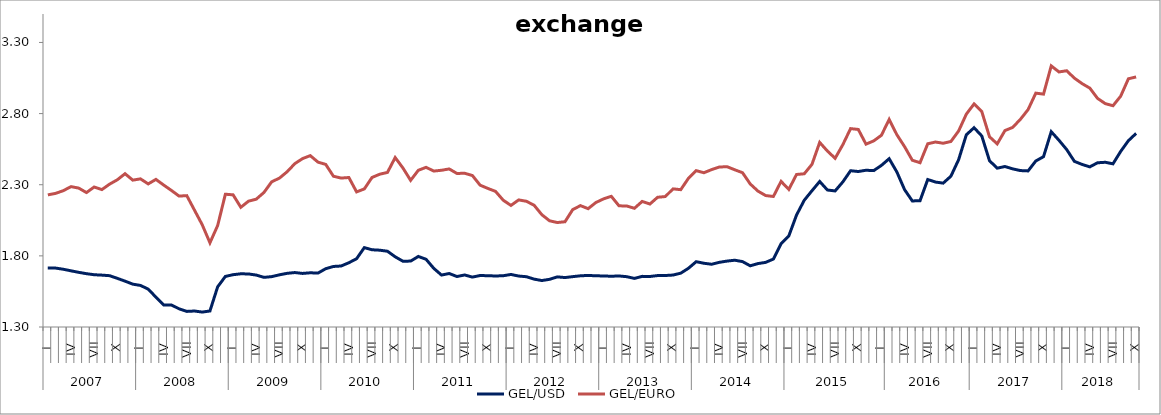
| Category | GEL/USD | GEL/EURO |
|---|---|---|
| 0 | 1.714 | 2.229 |
| 1 | 1.714 | 2.239 |
| 2 | 1.706 | 2.258 |
| 3 | 1.695 | 2.287 |
| 4 | 1.684 | 2.276 |
| 5 | 1.675 | 2.245 |
| 6 | 1.667 | 2.284 |
| 7 | 1.665 | 2.266 |
| 8 | 1.661 | 2.304 |
| 9 | 1.642 | 2.335 |
| 10 | 1.622 | 2.378 |
| 11 | 1.601 | 2.332 |
| 12 | 1.592 | 2.341 |
| 13 | 1.566 | 2.306 |
| 14 | 1.51 | 2.338 |
| 15 | 1.455 | 2.298 |
| 16 | 1.455 | 2.26 |
| 17 | 1.428 | 2.22 |
| 18 | 1.41 | 2.223 |
| 19 | 1.412 | 2.121 |
| 20 | 1.405 | 2.019 |
| 21 | 1.413 | 1.892 |
| 22 | 1.583 | 2.013 |
| 23 | 1.655 | 2.233 |
| 24 | 1.668 | 2.229 |
| 25 | 1.674 | 2.141 |
| 26 | 1.673 | 2.184 |
| 27 | 1.665 | 2.198 |
| 28 | 1.649 | 2.246 |
| 29 | 1.654 | 2.321 |
| 30 | 1.667 | 2.346 |
| 31 | 1.677 | 2.391 |
| 32 | 1.683 | 2.448 |
| 33 | 1.677 | 2.484 |
| 34 | 1.681 | 2.504 |
| 35 | 1.679 | 2.459 |
| 36 | 1.71 | 2.443 |
| 37 | 1.726 | 2.36 |
| 38 | 1.729 | 2.347 |
| 39 | 1.752 | 2.351 |
| 40 | 1.78 | 2.25 |
| 41 | 1.858 | 2.271 |
| 42 | 1.843 | 2.351 |
| 43 | 1.84 | 2.374 |
| 44 | 1.832 | 2.386 |
| 45 | 1.794 | 2.491 |
| 46 | 1.762 | 2.418 |
| 47 | 1.763 | 2.331 |
| 48 | 1.796 | 2.402 |
| 49 | 1.776 | 2.422 |
| 50 | 1.712 | 2.396 |
| 51 | 1.665 | 2.402 |
| 52 | 1.676 | 2.411 |
| 53 | 1.655 | 2.379 |
| 54 | 1.666 | 2.381 |
| 55 | 1.651 | 2.365 |
| 56 | 1.662 | 2.297 |
| 57 | 1.66 | 2.274 |
| 58 | 1.659 | 2.253 |
| 59 | 1.66 | 2.191 |
| 60 | 1.669 | 2.155 |
| 61 | 1.658 | 2.193 |
| 62 | 1.653 | 2.184 |
| 63 | 1.637 | 2.156 |
| 64 | 1.627 | 2.089 |
| 65 | 1.635 | 2.047 |
| 66 | 1.652 | 2.034 |
| 67 | 1.648 | 2.04 |
| 68 | 1.654 | 2.125 |
| 69 | 1.66 | 2.153 |
| 70 | 1.662 | 2.132 |
| 71 | 1.66 | 2.175 |
| 72 | 1.659 | 2.201 |
| 73 | 1.657 | 2.219 |
| 74 | 1.659 | 2.152 |
| 75 | 1.654 | 2.151 |
| 76 | 1.642 | 2.134 |
| 77 | 1.656 | 2.183 |
| 78 | 1.655 | 2.164 |
| 79 | 1.662 | 2.212 |
| 80 | 1.662 | 2.217 |
| 81 | 1.665 | 2.271 |
| 82 | 1.678 | 2.265 |
| 83 | 1.713 | 2.346 |
| 84 | 1.759 | 2.399 |
| 85 | 1.748 | 2.384 |
| 86 | 1.741 | 2.406 |
| 87 | 1.755 | 2.424 |
| 88 | 1.763 | 2.427 |
| 89 | 1.769 | 2.405 |
| 90 | 1.76 | 2.385 |
| 91 | 1.73 | 2.306 |
| 92 | 1.746 | 2.255 |
| 93 | 1.754 | 2.224 |
| 94 | 1.778 | 2.217 |
| 95 | 1.885 | 2.323 |
| 96 | 1.94 | 2.267 |
| 97 | 2.087 | 2.372 |
| 98 | 2.191 | 2.377 |
| 99 | 2.258 | 2.443 |
| 100 | 2.323 | 2.597 |
| 101 | 2.263 | 2.537 |
| 102 | 2.256 | 2.486 |
| 103 | 2.32 | 2.582 |
| 104 | 2.398 | 2.694 |
| 105 | 2.393 | 2.689 |
| 106 | 2.402 | 2.585 |
| 107 | 2.399 | 2.608 |
| 108 | 2.436 | 2.648 |
| 109 | 2.483 | 2.759 |
| 110 | 2.389 | 2.651 |
| 111 | 2.265 | 2.567 |
| 112 | 2.186 | 2.472 |
| 113 | 2.188 | 2.455 |
| 114 | 2.337 | 2.588 |
| 115 | 2.319 | 2.6 |
| 116 | 2.311 | 2.592 |
| 117 | 2.36 | 2.604 |
| 118 | 2.476 | 2.678 |
| 119 | 2.651 | 2.796 |
| 120 | 2.701 | 2.868 |
| 121 | 2.643 | 2.814 |
| 122 | 2.469 | 2.637 |
| 123 | 2.416 | 2.587 |
| 124 | 2.428 | 2.681 |
| 125 | 2.412 | 2.703 |
| 126 | 2.4 | 2.759 |
| 127 | 2.397 | 2.828 |
| 128 | 2.467 | 2.944 |
| 129 | 2.497 | 2.937 |
| 130 | 2.673 | 3.135 |
| 131 | 2.613 | 3.093 |
| 132 | 2.547 | 3.101 |
| 133 | 2.464 | 3.049 |
| 134 | 2.442 | 3.011 |
| 135 | 2.426 | 2.979 |
| 136 | 2.454 | 2.907 |
| 137 | 2.458 | 2.87 |
| 138 | 2.447 | 2.855 |
| 139 | 2.534 | 2.923 |
| 140 | 2.61 | 3.045 |
| 141 | 2.661 | 3.058 |